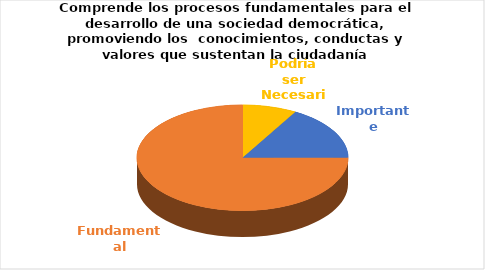
| Category | Series 0 |
|---|---|
| Podría ser Necesaria | 1 |
| Importante | 2 |
| Fundamental | 9 |